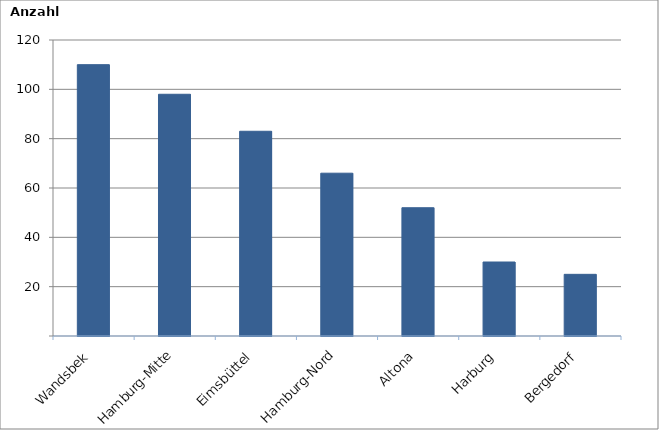
| Category | Series 0 |
|---|---|
| Wandsbek | 110 |
| Hamburg-Mitte | 98 |
| Eimsbüttel | 83 |
| Hamburg-Nord | 66 |
| Altona | 52 |
| Harburg | 30 |
| Bergedorf | 25 |